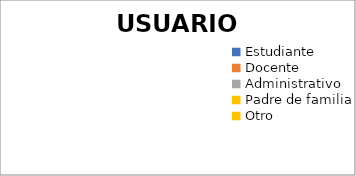
| Category | Series 0 |
|---|---|
| Estudiante | 0 |
| Docente | 0 |
| Administrativo | 0 |
| Padre de familia | 0 |
| Otro | 0 |